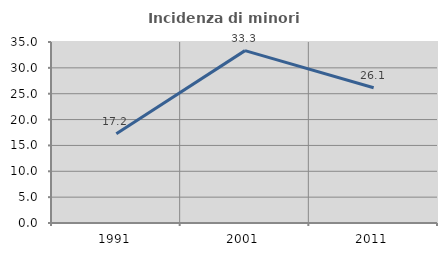
| Category | Incidenza di minori stranieri |
|---|---|
| 1991.0 | 17.241 |
| 2001.0 | 33.333 |
| 2011.0 | 26.142 |